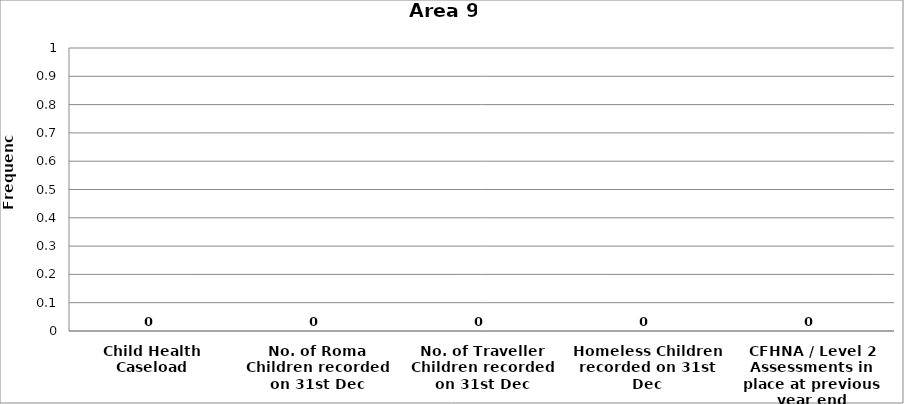
| Category | Area 9 |
|---|---|
| Child Health Caseload | 0 |
| No. of Roma Children recorded on 31st Dec | 0 |
| No. of Traveller Children recorded on 31st Dec | 0 |
| Homeless Children recorded on 31st Dec | 0 |
| CFHNA / Level 2 Assessments in place at previous year end | 0 |